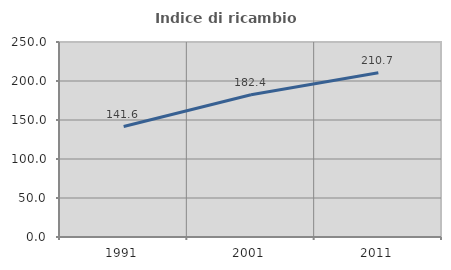
| Category | Indice di ricambio occupazionale  |
|---|---|
| 1991.0 | 141.631 |
| 2001.0 | 182.383 |
| 2011.0 | 210.672 |